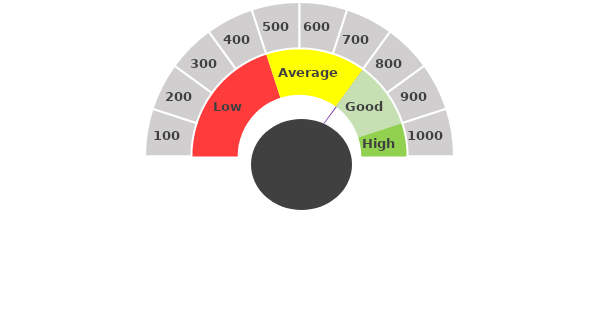
| Category | January |
|---|---|
| 0 | 475 |
| 1 | 5 |
| 2 | 1520 |